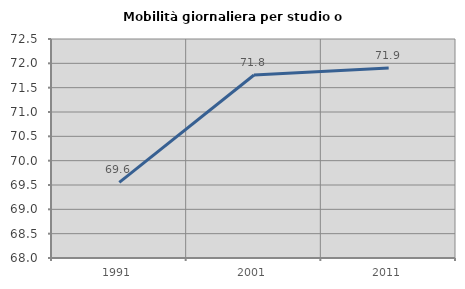
| Category | Mobilità giornaliera per studio o lavoro |
|---|---|
| 1991.0 | 69.554 |
| 2001.0 | 71.761 |
| 2011.0 | 71.903 |